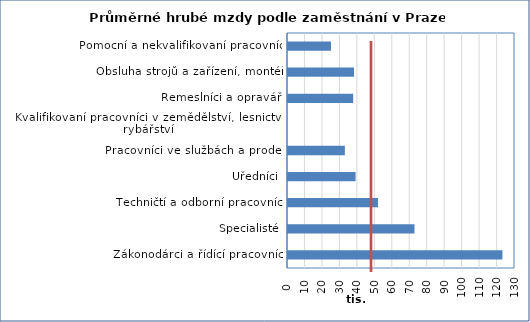
| Category | Series 0 |
|---|---|
| Zákonodárci a řídící pracovníci | 122791 |
| Specialisté | 72448 |
| Techničtí a odborní pracovníci | 51523 |
| Úředníci | 38697 |
| Pracovníci ve službách a prodeji | 32560 |
| Kvalifikovaní pracovníci v zemědělství, lesnictví a rybářství | 0 |
| Řemeslníci a opraváři | 37332 |
| Obsluha strojů a zařízení, montéři | 37820 |
| Pomocní a nekvalifikovaní pracovníci | 24608 |